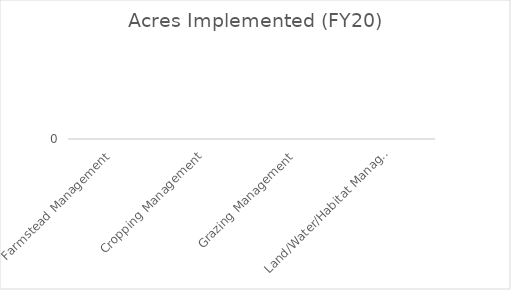
| Category | ac |
|---|---|
| Farmstead Management | 0 |
| Cropping Management | 0 |
| Grazing Management | 0 |
| Land/Water/Habitat Management | 0 |